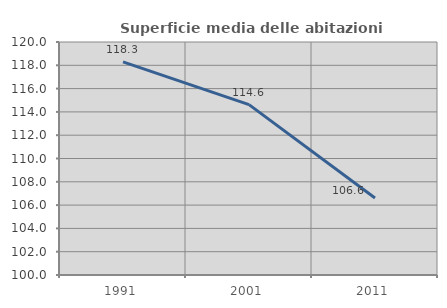
| Category | Superficie media delle abitazioni occupate |
|---|---|
| 1991.0 | 118.3 |
| 2001.0 | 114.622 |
| 2011.0 | 106.606 |